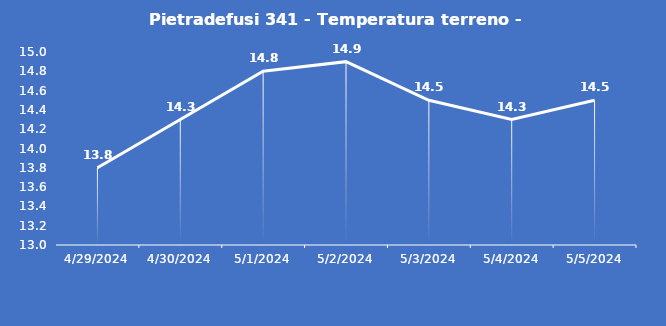
| Category | Pietradefusi 341 - Temperatura terreno - Grezzo (°C) |
|---|---|
| 4/29/24 | 13.8 |
| 4/30/24 | 14.3 |
| 5/1/24 | 14.8 |
| 5/2/24 | 14.9 |
| 5/3/24 | 14.5 |
| 5/4/24 | 14.3 |
| 5/5/24 | 14.5 |